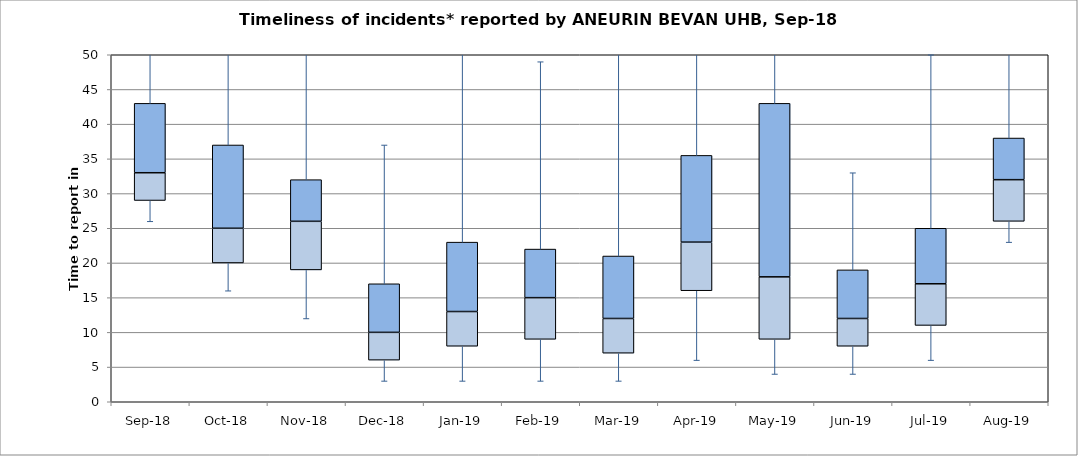
| Category | Series 0 | Series 1 | Series 2 |
|---|---|---|---|
| Sep-18 | 29 | 4 | 10 |
| Oct-18 | 20 | 5 | 12 |
| Nov-18 | 19 | 7 | 6 |
| Dec-18 | 6 | 4 | 7 |
| Jan-19 | 8 | 5 | 10 |
| Feb-19 | 9 | 6 | 7 |
| Mar-19 | 7 | 5 | 9 |
| Apr-19 | 16 | 7 | 12.5 |
| May-19 | 9 | 9 | 25 |
| Jun-19 | 8 | 4 | 7 |
| Jul-19 | 11 | 6 | 8 |
| Aug-19 | 26 | 6 | 6 |